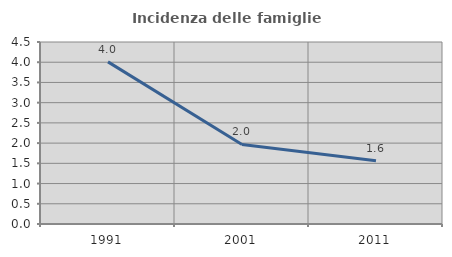
| Category | Incidenza delle famiglie numerose |
|---|---|
| 1991.0 | 4.008 |
| 2001.0 | 1.966 |
| 2011.0 | 1.564 |